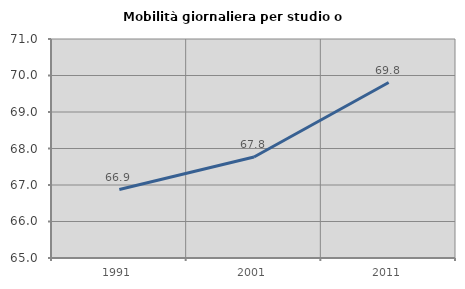
| Category | Mobilità giornaliera per studio o lavoro |
|---|---|
| 1991.0 | 66.875 |
| 2001.0 | 67.765 |
| 2011.0 | 69.808 |